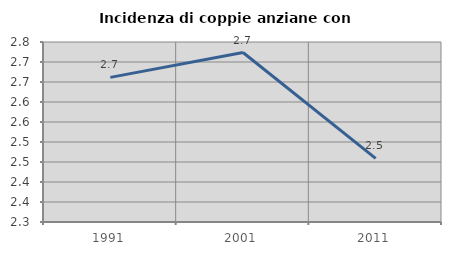
| Category | Incidenza di coppie anziane con figli |
|---|---|
| 1991.0 | 2.662 |
| 2001.0 | 2.724 |
| 2011.0 | 2.459 |